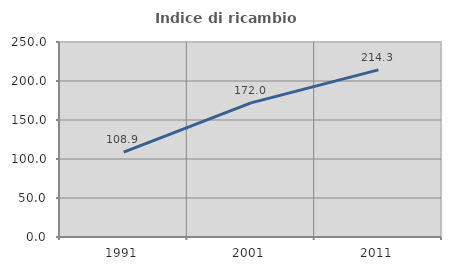
| Category | Indice di ricambio occupazionale  |
|---|---|
| 1991.0 | 108.889 |
| 2001.0 | 172 |
| 2011.0 | 214.286 |